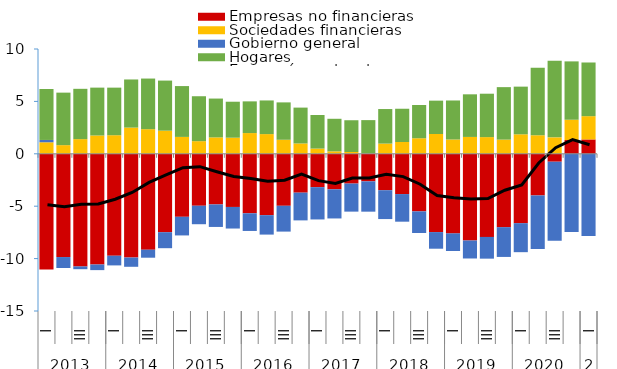
| Category | Empresas no financieras | Sociedades financieras | Gobierno general | Hogares |
|---|---|---|---|---|
| 0 | -11.045 | 1.099 | 0.223 | 4.861 |
| 1 | -9.852 | 0.825 | -1.045 | 5.012 |
| 2 | -10.748 | 1.4 | -0.263 | 4.801 |
| 3 | -10.565 | 1.748 | -0.534 | 4.567 |
| 4 | -9.728 | 1.773 | -0.921 | 4.54 |
| 5 | -9.9 | 2.501 | -0.882 | 4.591 |
| 6 | -9.151 | 2.35 | -0.763 | 4.83 |
| 7 | -7.481 | 2.207 | -1.526 | 4.78 |
| 8 | -6.012 | 1.612 | -1.777 | 4.85 |
| 9 | -4.957 | 1.204 | -1.763 | 4.288 |
| 10 | -4.832 | 1.567 | -2.147 | 3.704 |
| 11 | -5.072 | 1.537 | -2.059 | 3.433 |
| 12 | -5.676 | 1.979 | -1.687 | 3.024 |
| 13 | -5.855 | 1.88 | -1.854 | 3.211 |
| 14 | -4.961 | 1.34 | -2.463 | 3.566 |
| 15 | -3.708 | 0.988 | -2.646 | 3.42 |
| 16 | -3.183 | 0.5 | -3.082 | 3.203 |
| 17 | -3.387 | 0.234 | -2.782 | 3.108 |
| 18 | -2.842 | 0.169 | -2.676 | 3.033 |
| 19 | -2.627 | 0.031 | -2.895 | 3.184 |
| 20 | -3.474 | 0.974 | -2.754 | 3.297 |
| 21 | -3.842 | 1.125 | -2.636 | 3.174 |
| 22 | -5.494 | 1.484 | -2.065 | 3.172 |
| 23 | -7.469 | 1.889 | -1.587 | 3.183 |
| 24 | -7.595 | 1.366 | -1.682 | 3.722 |
| 25 | -8.274 | 1.61 | -1.715 | 4.066 |
| 26 | -7.93 | 1.592 | -2.075 | 4.142 |
| 27 | -7 | 1.354 | -2.841 | 5.007 |
| 28 | -6.621 | 1.86 | -2.766 | 4.549 |
| 29 | -3.975 | 1.768 | -5.111 | 6.442 |
| 30 | -0.754 | 1.57 | -7.553 | 7.313 |
| 31 | 1.314 | 1.937 | -7.462 | 5.568 |
| 32 | 1.371 | 2.22 | -7.85 | 5.122 |